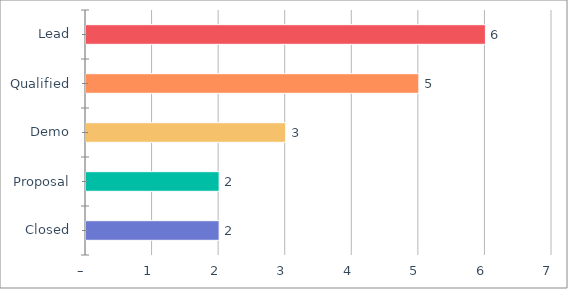
| Category | Series 0 |
|---|---|
| Lead | 6 |
| Qualified | 5 |
| Demo | 3 |
| Proposal | 2 |
| Closed | 2 |